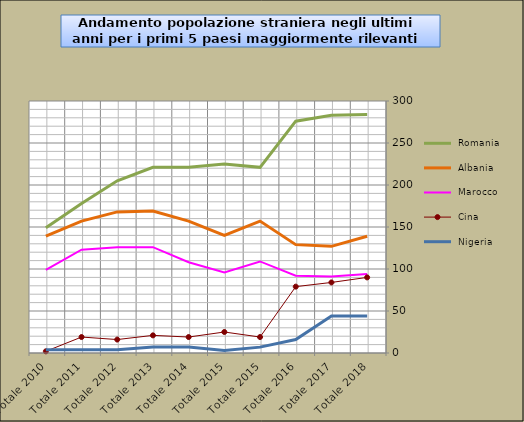
| Category |  Romania  |  Albania  |  Marocco  |  Cina  |  Nigeria  |
|---|---|---|---|---|---|
| Totale 2018 | 284 | 139 | 94 | 90 | 44 |
| Totale 2017 | 283 | 127 | 91 | 84 | 44 |
| Totale 2016 | 276 | 129 | 92 | 79 | 16 |
| Totale 2015 | 221 | 157 | 109 | 19 | 7 |
| Totale 2015 | 225 | 140 | 96 | 25 | 3 |
| Totale 2014 | 221 | 157 | 108 | 19 | 7 |
| Totale 2013 | 221 | 169 | 126 | 21 | 7 |
| Totale 2012 | 205 | 168 | 126 | 16 | 4 |
| Totale 2011 | 178 | 157 | 123 | 19 | 4 |
| Totale 2010 | 149 | 139 | 99 | 2 | 4 |